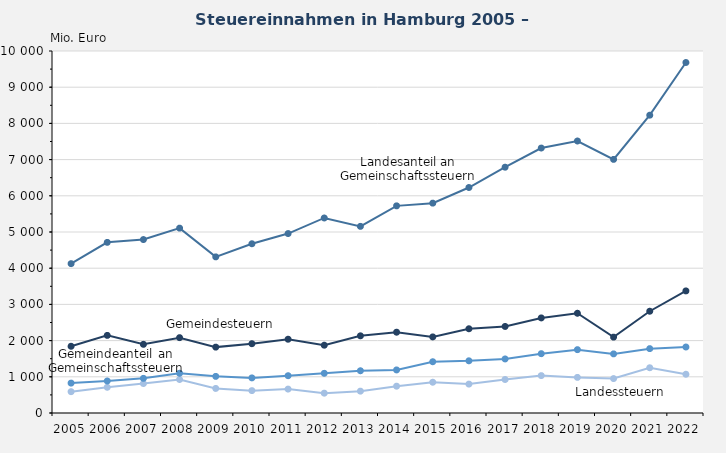
| Category | Landessteuern | Landesanteil an Gemeinschaftssteuern | Gemeindesteuern | Gemeindeanteil an Gemeinschaftssteuern |
|---|---|---|---|---|
| 2005.0 | 589 | 4126 | 1843 | 826 |
| 2006.0 | 711 | 4714 | 2144 | 885 |
| 2007.0 | 814 | 4791 | 1897 | 957 |
| 2008.0 | 925 | 5107 | 2081 | 1098 |
| 2009.0 | 679 | 4313 | 1820 | 1012 |
| 2010.0 | 618 | 4675 | 1914 | 970 |
| 2011.0 | 661 | 4957 | 2038 | 1030 |
| 2012.0 | 548 | 5388 | 1873 | 1096 |
| 2013.0 | 604 | 5156 | 2132 | 1167 |
| 2014.0 | 741 | 5722 | 2232 | 1190 |
| 2015.0 | 850 | 5797 | 2102 | 1416 |
| 2016.0 | 798 | 6229 | 2327 | 1442 |
| 2017.0 | 925 | 6790 | 2391 | 1493 |
| 2018.0 | 1033 | 7319 | 2627 | 1639 |
| 2019.0 | 984 | 7514 | 2755 | 1750 |
| 2020.0 | 951 | 7006 | 2096 | 1633 |
| 2021.0 | 1250 | 8227 | 2811 | 1778 |
| 2022.0 | 1070 | 9682 | 3373 | 1823 |